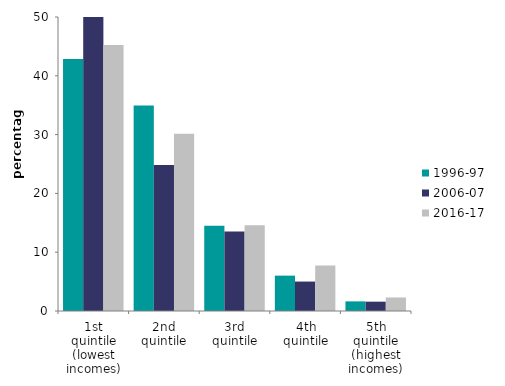
| Category | 1996-97 | 2006-07 | 2016-17 |
|---|---|---|---|
| 1st quintile (lowest incomes) | 42.877 | 55.076 | 45.246 |
| 2nd quintile | 34.957 | 24.829 | 30.137 |
| 3rd quintile | 14.516 | 13.502 | 14.594 |
| 4th quintile | 6.013 | 5.007 | 7.721 |
| 5th quintile (highest incomes) | 1.638 | 1.587 | 2.302 |